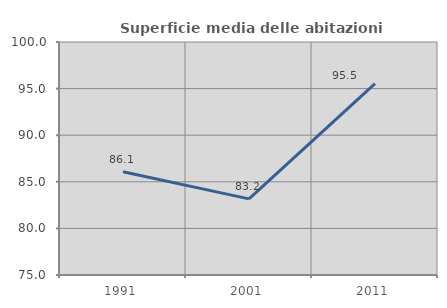
| Category | Superficie media delle abitazioni occupate |
|---|---|
| 1991.0 | 86.086 |
| 2001.0 | 83.169 |
| 2011.0 | 95.527 |